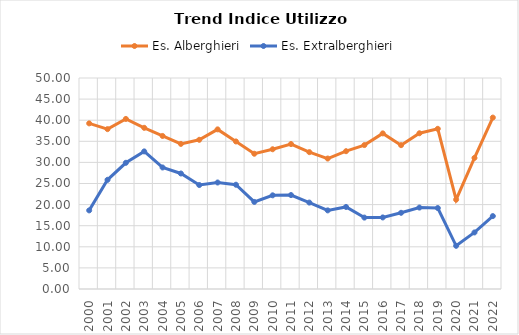
| Category | Es. Alberghieri | Es. Extralberghieri |
|---|---|---|
| 2000.0 | 39.246 | 18.627 |
| 2001.0 | 37.884 | 25.875 |
| 2002.0 | 40.3 | 29.905 |
| 2003.0 | 38.193 | 32.607 |
| 2004.0 | 36.264 | 28.8 |
| 2005.0 | 34.386 | 27.372 |
| 2006.0 | 35.355 | 24.636 |
| 2007.0 | 37.826 | 25.238 |
| 2008.0 | 34.963 | 24.711 |
| 2009.0 | 32.052 | 20.632 |
| 2010.0 | 33.115 | 22.197 |
| 2011.0 | 34.35 | 22.261 |
| 2012.0 | 32.433 | 20.478 |
| 2013.0 | 30.914 | 18.626 |
| 2014.0 | 32.654 | 19.445 |
| 2015.0 | 34.111 | 16.922 |
| 2016.0 | 36.874 | 16.955 |
| 2017.0 | 34.087 | 18.056 |
| 2018.0 | 36.903 | 19.301 |
| 2019.0 | 37.957 | 19.184 |
| 2020.0 | 21.179 | 10.229 |
| 2021.0 | 31.066 | 13.4 |
| 2022.0 | 40.618 | 17.277 |